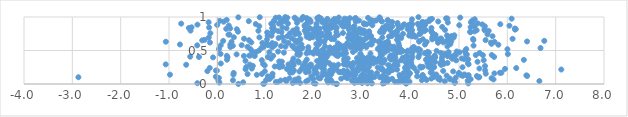
| Category | Series 0 |
|---|---|
| 0.433406203005279 | 0.001 |
| 2.455961428554003 | 0.002 |
| 2.4745443741867836 | 0.003 |
| 0.9495079879234387 | 0.004 |
| 0.9693533342767289 | 0.005 |
| 3.9064680235757203 | 0.006 |
| 2.032211599027284 | 0.007 |
| 3.4237041263236727 | 0.008 |
| 5.191488238184567 | 0.009 |
| 3.197623193400388 | 0.01 |
| 3.1062827954152468 | 0.011 |
| -0.4133370172218176 | 0.012 |
| 1.9940901045999615 | 0.013 |
| 3.454002756618558 | 0.014 |
| 2.9946979914708836 | 0.015 |
| 1.5606047050287666 | 0.016 |
| 1.711043177630597 | 0.017 |
| 2.835530518199697 | 0.018 |
| 4.913410823604459 | 0.019 |
| 3.9270730843557264 | 0.02 |
| 0.04179513812483959 | 0.021 |
| 4.9093540350894465 | 0.022 |
| 2.3823111095607628 | 0.023 |
| 2.2913278669526655 | 0.024 |
| 0.5345523313564993 | 0.025 |
| 3.1421569388580415 | 0.026 |
| 3.867961752969226 | 0.027 |
| 2.9026171103836513 | 0.028 |
| 1.2473112850614152 | 0.029 |
| 1.2107270474180178 | 0.03 |
| 2.928849977832298 | 0.031 |
| 3.678643029461803 | 0.032 |
| 3.7395020028709856 | 0.033 |
| 1.6294021524454356 | 0.034 |
| 3.442477697648176 | 0.035 |
| 3.9755267955850773 | 0.036 |
| 1.8344930540314195 | 0.037 |
| 3.5189481904066566 | 0.038 |
| 2.324864171294502 | 0.039 |
| 3.7868283321641827 | 0.04 |
| 4.706785700476023 | 0.041 |
| 3.7609331124991474 | 0.042 |
| 1.4282557488124037 | 0.043 |
| 6.662456215287102 | 0.044 |
| 3.12931189677252 | 0.045 |
| 4.903055705513007 | 0.046 |
| 2.985785873077796 | 0.047 |
| 0.021490604469981633 | 0.048 |
| 5.180719284607355 | 0.049 |
| 2.783544893933005 | 0.05 |
| 3.477694237530164 | 0.051 |
| 2.3557930262261646 | 0.052 |
| 1.3084953975069364 | 0.053 |
| 3.5257851961947537 | 0.054 |
| 1.8752772858321407 | 0.055 |
| 0.3236483525478566 | 0.056 |
| 2.272043295873837 | 0.057 |
| 4.230857491975614 | 0.058 |
| 1.0105811214308886 | 0.059 |
| 4.3293069638605 | 0.06 |
| 3.0391172939564073 | 0.061 |
| 4.607147102071846 | 0.062 |
| 1.4023565384671621 | 0.063 |
| 3.547443763331814 | 0.064 |
| 1.6080654978058684 | 0.065 |
| 2.27851862813694 | 0.066 |
| 2.9180463560958176 | 0.067 |
| 5.714169577120845 | 0.068 |
| 4.81631328014728 | 0.069 |
| 3.172775093318746 | 0.07 |
| 2.335980047589448 | 0.071 |
| 5.241093778006275 | 0.072 |
| 1.0809395475607664 | 0.073 |
| 4.57223646115447 | 0.074 |
| 3.8013023312159326 | 0.075 |
| 3.8848486855044384 | 0.076 |
| 1.9826239745048655 | 0.077 |
| 3.616203335723952 | 0.078 |
| 3.8661238379159437 | 0.079 |
| 2.5627440927354077 | 0.08 |
| 4.427377434416879 | 0.081 |
| 4.807672710640514 | 0.082 |
| 2.1267868229194655 | 0.083 |
| 1.6797824712612184 | 0.084 |
| 1.4921432337653746 | 0.085 |
| 2.686488584569814 | 0.086 |
| 5.673363791608432 | 0.087 |
| 3.8794747989132143 | 0.088 |
| 3.1485458946173868 | 0.089 |
| 4.285569995633408 | 0.09 |
| 0.031613688493364656 | 0.091 |
| 2.8314805430813177 | 0.092 |
| 2.090443932333257 | 0.093 |
| 4.929931007135928 | 0.094 |
| 4.590932748839785 | 0.095 |
| 2.9896711352269487 | 0.096 |
| 3.1190349602360223 | 0.097 |
| 5.400661633794589 | 0.098 |
| 3.401215901869634 | 0.099 |
| 3.3640839062461936 | 0.1 |
| -2.874371161384751 | 0.101 |
| 3.495555616137263 | 0.102 |
| 5.420175968604175 | 0.103 |
| 3.2505829812392024 | 0.104 |
| 4.476533786275703 | 0.105 |
| 3.213087481304124 | 0.106 |
| 2.645851072830028 | 0.107 |
| -0.03139757301020074 | 0.108 |
| 3.9402070032409062 | 0.109 |
| 1.137892811341772 | 0.11 |
| 3.7812016109737723 | 0.111 |
| 2.966747583356991 | 0.112 |
| 1.945159183891883 | 0.113 |
| 1.0470969959560064 | 0.114 |
| 4.134707946744852 | 0.115 |
| 3.0568385883245495 | 0.116 |
| 4.232409495364311 | 0.117 |
| 3.082870049978325 | 0.118 |
| 5.370573303278861 | 0.119 |
| 6.4110882686164175 | 0.12 |
| 5.076096046817723 | 0.121 |
| 3.4249545165637065 | 0.122 |
| 2.660474854600866 | 0.123 |
| 5.167292493237691 | 0.124 |
| 4.744724965480547 | 0.125 |
| 2.9901152619849936 | 0.126 |
| 2.267688651592453 | 0.127 |
| 2.1712707075257804 | 0.128 |
| 6.394194503319242 | 0.129 |
| 2.774944910618179 | 0.13 |
| 2.8219280828635895 | 0.131 |
| 5.19954475353272 | 0.132 |
| 5.044163896952343 | 0.133 |
| 3.7696930359223186 | 0.134 |
| 4.2500208464785985 | 0.135 |
| 3.1634540883453193 | 0.136 |
| 0.8170210754855374 | 0.137 |
| 3.9553654544281756 | 0.138 |
| -0.9797764063120287 | 0.139 |
| 0.3330916016052976 | 0.14 |
| 2.7231767775907443 | 0.141 |
| 4.530317933429905 | 0.142 |
| 5.112469271632039 | 0.143 |
| 2.23538095463981 | 0.144 |
| 2.3571346448311568 | 0.145 |
| 2.8554680689556866 | 0.146 |
| 2.793147388001092 | 0.147 |
| 0.6248139546530149 | 0.148 |
| 3.0162759317916072 | 0.149 |
| 0.9227392671378563 | 0.15 |
| 2.2787335454412037 | 0.151 |
| 4.991888161631538 | 0.152 |
| 1.1424394217673832 | 0.153 |
| 5.553505389482748 | 0.154 |
| 2.7567883056229574 | 0.155 |
| 2.8413105623002033 | 0.156 |
| 2.685169831352669 | 0.157 |
| 5.73212138711806 | 0.158 |
| 2.0135413961092326 | 0.159 |
| 3.9862191104444022 | 0.16 |
| 2.060564953010336 | 0.161 |
| 4.448554153877141 | 0.162 |
| 3.3044871747594016 | 0.163 |
| 3.855711654246229 | 0.164 |
| 0.3383989878018201 | 0.165 |
| 4.999446941886108 | 0.166 |
| 5.846532609830787 | 0.167 |
| 5.87810869456047 | 0.168 |
| 4.414516732018474 | 0.169 |
| 1.5044925813611623 | 0.17 |
| 3.544043676043983 | 0.171 |
| 3.1868985063273465 | 0.172 |
| 1.5525500208391323 | 0.173 |
| 2.1873850770681047 | 0.174 |
| 2.5980843754538854 | 0.175 |
| 2.8413041428056927 | 0.176 |
| 1.8333673138569937 | 0.177 |
| 2.5311164969131332 | 0.178 |
| 2.561619623746897 | 0.179 |
| 2.5184609847732724 | 0.18 |
| 1.558586708428746 | 0.181 |
| 3.458095119259605 | 0.182 |
| 3.9337303444747667 | 0.183 |
| 1.8930225047535307 | 0.184 |
| 4.1303122407973 | 0.185 |
| 3.5348796043244493 | 0.186 |
| 1.6984362721324238 | 0.187 |
| 4.879335723067961 | 0.188 |
| 2.39066929555055 | 0.189 |
| 0.9820616294683111 | 0.19 |
| 2.349471948776383 | 0.191 |
| -0.20622812885411523 | 0.192 |
| 2.6870245118536706 | 0.193 |
| 3.5644388220072227 | 0.194 |
| 4.672495970156278 | 0.195 |
| 2.6109930012156215 | 0.196 |
| 3.1085158095455934 | 0.197 |
| 2.6140681158383563 | 0.198 |
| 2.9175555346233377 | 0.199 |
| -0.009156678107293814 | 0.2 |
| -0.029717201938892046 | 0.201 |
| 2.3296456316821827 | 0.202 |
| 1.516201662804892 | 0.203 |
| 5.5420797187697985 | 0.204 |
| 1.5841806196667418 | 0.205 |
| 2.017050925264892 | 0.206 |
| 3.537529636797519 | 0.207 |
| 3.6228718284947594 | 0.208 |
| 1.8771756532021673 | 0.209 |
| 2.869864289640559 | 0.21 |
| 3.5956838509661435 | 0.211 |
| 3.0702563854134266 | 0.212 |
| 3.423742710201323 | 0.213 |
| 3.7187169872235666 | 0.214 |
| 2.812386476052351 | 0.215 |
| 7.116300941701926 | 0.216 |
| 4.433614699789565 | 0.217 |
| 2.0163643150392647 | 0.218 |
| 2.2096791085026504 | 0.219 |
| 0.5841887295727042 | 0.22 |
| 2.033441266630586 | 0.221 |
| 3.387893006235012 | 0.222 |
| 3.0115222725438593 | 0.223 |
| 1.4406813242816647 | 0.224 |
| 1.74310093903213 | 0.225 |
| 5.952122613992327 | 0.226 |
| 3.899275799053804 | 0.227 |
| 3.5916824842867983 | 0.228 |
| 2.461454934377313 | 0.229 |
| 0.7125802124828446 | 0.23 |
| 5.422002526063665 | 0.231 |
| 3.402020201747456 | 0.232 |
| 3.939506963020597 | 0.233 |
| 3.894789101516804 | 0.234 |
| 4.076907313685656 | 0.235 |
| 3.0404356301352604 | 0.236 |
| 1.8185088259299738 | 0.237 |
| 6.184413097506664 | 0.238 |
| 2.164233322044132 | 0.239 |
| -0.15672266387859857 | 0.24 |
| 2.394444686801133 | 0.241 |
| 1.52142980942165 | 0.242 |
| 2.970563321985286 | 0.243 |
| 4.2157361777445495 | 0.244 |
| 3.8846207362941456 | 0.245 |
| 1.9062157312703696 | 0.246 |
| 2.914615563894199 | 0.247 |
| 3.3177005627014244 | 0.248 |
| 1.2862369824787816 | 0.249 |
| 5.072657080252856 | 0.25 |
| 2.999518489264708 | 0.251 |
| 4.487516456978575 | 0.252 |
| 4.438827066100286 | 0.253 |
| 0.5990141986188813 | 0.254 |
| 4.2508821463535975 | 0.255 |
| 4.369271166178407 | 0.256 |
| 1.8432811012393557 | 0.257 |
| 2.0633296960884855 | 0.258 |
| 3.1383309955955863 | 0.259 |
| 4.198999931151551 | 0.26 |
| 1.1870391838443677 | 0.261 |
| 1.822377488826266 | 0.262 |
| 1.344572357039262 | 0.263 |
| 2.7681112013616924 | 0.264 |
| 1.9371781937895758 | 0.265 |
| 1.2547523981015107 | 0.266 |
| 4.032393742789642 | 0.267 |
| 5.538436932031248 | 0.268 |
| 3.5686026573446243 | 0.269 |
| 0.7343409698867789 | 0.27 |
| 4.424094634146526 | 0.271 |
| 2.2096152797087774 | 0.272 |
| 1.7718779706575765 | 0.273 |
| 1.3306792589776077 | 0.274 |
| 1.9033420260042475 | 0.275 |
| 3.6695706444362544 | 0.276 |
| 0.9806171049153694 | 0.277 |
| 3.7278641329516864 | 0.278 |
| 2.410791099965361 | 0.279 |
| 2.3608054717036087 | 0.28 |
| 1.5797645903532418 | 0.281 |
| 3.537570186387234 | 0.282 |
| 2.6793927417191123 | 0.283 |
| 2.932873720122935 | 0.284 |
| 4.631332082336149 | 0.285 |
| 3.016490131911206 | 0.286 |
| -0.6446765844134013 | 0.287 |
| 2.5011338826058247 | 0.288 |
| 0.673159879223574 | 0.289 |
| 2.8064738042508948 | 0.29 |
| 1.9350010330616683 | 0.291 |
| 1.4710841373510188 | 0.292 |
| -1.067251602480349 | 0.293 |
| 5.198583349350598 | 0.294 |
| 2.6166351177052034 | 0.295 |
| 2.197346859856952 | 0.296 |
| 2.6582796417986283 | 0.297 |
| 0.9474509103472548 | 0.298 |
| 3.6711489328508753 | 0.299 |
| 4.687769789112732 | 0.3 |
| 3.937931021520515 | 0.301 |
| 3.002494293468421 | 0.302 |
| 2.1142414061964745 | 0.303 |
| 2.7261535059268813 | 0.304 |
| 4.347881903017035 | 0.305 |
| 0.071565977491439 | 0.306 |
| 3.057749961234721 | 0.307 |
| 3.225472294749322 | 0.308 |
| 4.612884780207927 | 0.309 |
| 5.1850954145798696 | 0.31 |
| 2.313745448356408 | 0.311 |
| 3.392146835378293 | 0.312 |
| 3.1610323694090567 | 0.313 |
| 4.762838548146766 | 0.314 |
| 2.8113030056176096 | 0.315 |
| 4.012001490852661 | 0.316 |
| 1.5652368719003151 | 0.317 |
| 3.0320992184602122 | 0.318 |
| 3.4390666586129077 | 0.319 |
| 3.8981279942992657 | 0.32 |
| 4.6740196753586485 | 0.321 |
| 1.6881831441328559 | 0.322 |
| 3.720119070272841 | 0.323 |
| 2.960474281754348 | 0.324 |
| 4.658906868766254 | 0.325 |
| 2.249874276477222 | 0.326 |
| 1.8170352289345493 | 0.327 |
| 2.218926855445053 | 0.328 |
| 4.504396182942956 | 0.329 |
| 2.937090507548071 | 0.33 |
| 3.2926480081245035 | 0.331 |
| 5.383044562931419 | 0.332 |
| 1.3350791302983214 | 0.333 |
| 2.1539800166078162 | 0.334 |
| 2.9099082290787903 | 0.335 |
| 1.551092722400432 | 0.336 |
| 1.2808134876521806 | 0.337 |
| 3.146044698958432 | 0.338 |
| 2.911539946373089 | 0.339 |
| 4.421425987124862 | 0.34 |
| 1.670607375625044 | 0.341 |
| 2.6677681504309625 | 0.342 |
| 3.6869777367346264 | 0.343 |
| 2.066003015287592 | 0.344 |
| 4.379432438147376 | 0.345 |
| 0.5828494873369667 | 0.346 |
| 2.625524414901472 | 0.347 |
| 3.054927460145107 | 0.348 |
| 3.9316433258300263 | 0.349 |
| 4.64523830556751 | 0.35 |
| 3.3163692954578456 | 0.351 |
| 3.80158365987931 | 0.352 |
| 4.94071738618581 | 0.353 |
| 3.397151115394642 | 0.354 |
| 5.511507489218757 | 0.355 |
| 0.9200240048465811 | 0.356 |
| 2.9530509573819392 | 0.357 |
| 3.4624518285455097 | 0.358 |
| 3.2261044184439784 | 0.359 |
| 6.342050448670875 | 0.36 |
| 2.1489383638727384 | 0.361 |
| 4.316988510900666 | 0.362 |
| 0.2004284523663049 | 0.363 |
| 3.59413761229386 | 0.364 |
| 1.8508825857323807 | 0.365 |
| 2.236741245863824 | 0.366 |
| 3.255358244175054 | 0.367 |
| 3.0695281044987026 | 0.368 |
| 5.189724500962329 | 0.369 |
| 2.629705236256157 | 0.37 |
| 5.109261519629397 | 0.371 |
| 3.6002409682398744 | 0.372 |
| 3.1036273068125277 | 0.373 |
| 4.341620644056496 | 0.374 |
| 4.021090957251289 | 0.375 |
| 3.33515232051637 | 0.376 |
| 4.858507284054639 | 0.377 |
| 1.1078842212109339 | 0.378 |
| 4.393679317864555 | 0.379 |
| 1.5742667782113124 | 0.38 |
| 5.056246118223488 | 0.381 |
| 2.697105298945747 | 0.382 |
| 2.631431480851429 | 0.383 |
| 2.1446063875739867 | 0.384 |
| 3.2240754921127164 | 0.385 |
| 3.1623550148128694 | 0.386 |
| 2.890325377794781 | 0.387 |
| 3.5781290913128942 | 0.388 |
| 3.6842786999521917 | 0.389 |
| 4.645459688118855 | 0.39 |
| 3.8377093619774802 | 0.391 |
| 4.461653870912027 | 0.392 |
| 4.504455097273155 | 0.393 |
| 3.0199913646056915 | 0.394 |
| 3.112117187130057 | 0.395 |
| 4.5003339397737285 | 0.396 |
| -0.08806049532351246 | 0.397 |
| 0.21103122803625762 | 0.398 |
| 3.566890213062631 | 0.399 |
| 4.16160637055626 | 0.4 |
| 3.368035666374416 | 0.401 |
| 1.04578313792129 | 0.402 |
| -0.3800176235504078 | 0.403 |
| 5.726043314264685 | 0.404 |
| 2.193879711319996 | 0.405 |
| 3.6049676504243084 | 0.406 |
| 4.360779487615515 | 0.407 |
| -0.5607185213989334 | 0.408 |
| 2.2678868247910695 | 0.409 |
| 3.9009364545702705 | 0.41 |
| 4.035483805236081 | 0.411 |
| 4.835733636397794 | 0.412 |
| 3.9373779891942373 | 0.413 |
| 4.764167917381586 | 0.414 |
| 4.499151094981743 | 0.415 |
| 2.1569645219022027 | 0.416 |
| 0.773382963049527 | 0.417 |
| 0.5496712782778808 | 0.418 |
| 0.19712383571018854 | 0.419 |
| 1.1554509146220258 | 0.42 |
| 2.4900248882222353 | 0.421 |
| 2.50055186431308 | 0.422 |
| 4.497658460105326 | 0.423 |
| 0.661734469907155 | 0.424 |
| 4.664985400821825 | 0.425 |
| 0.6840152151315353 | 0.426 |
| 3.5856634208931486 | 0.427 |
| 2.4607021674562026 | 0.428 |
| 4.907435216153153 | 0.429 |
| 4.9335699046222175 | 0.43 |
| 5.494207713090859 | 0.431 |
| 5.347238438976902 | 0.432 |
| 5.678617689675263 | 0.433 |
| 1.6975745666098976 | 0.434 |
| 3.643725784397127 | 0.435 |
| 3.4142717524806434 | 0.436 |
| 2.9670278408366237 | 0.437 |
| 4.181143559498025 | 0.438 |
| 1.6546012893084976 | 0.439 |
| 2.1206696673553296 | 0.44 |
| 5.161439929362242 | 0.441 |
| 0.3985520744067248 | 0.442 |
| 5.144110561220926 | 0.443 |
| 2.1948050813824715 | 0.444 |
| 2.589502192470002 | 0.445 |
| 2.2315340804472177 | 0.446 |
| 6.010787955148325 | 0.447 |
| 3.3811623540324107 | 0.448 |
| 0.0669703798328869 | 0.449 |
| 4.701921866589574 | 0.45 |
| 2.9581791759787506 | 0.451 |
| 2.515397616806584 | 0.452 |
| 2.320815072447309 | 0.453 |
| 1.9879497399550097 | 0.454 |
| 3.1678428668606093 | 0.455 |
| 1.710988028014695 | 0.456 |
| 1.8453657625763844 | 0.457 |
| 2.4112731262098803 | 0.458 |
| 3.703328311315535 | 0.459 |
| 2.661158216050798 | 0.46 |
| 4.293563466866463 | 0.461 |
| 4.628109108987591 | 0.462 |
| 5.425860787480424 | 0.463 |
| 2.0619871193814983 | 0.464 |
| 4.031945940942072 | 0.465 |
| 1.6672273426977728 | 0.466 |
| 4.378380967245059 | 0.467 |
| 1.3770377208201303 | 0.468 |
| 4.334607501041424 | 0.469 |
| 2.2901986574031046 | 0.47 |
| 1.905763268021623 | 0.471 |
| 1.9816371634264445 | 0.472 |
| 5.012767531658353 | 0.473 |
| 3.7923520888815387 | 0.474 |
| 1.076445613893024 | 0.475 |
| 4.785006216247485 | 0.476 |
| 0.8041892866706024 | 0.477 |
| 2.8079577648817264 | 0.478 |
| 3.7115127431072636 | 0.479 |
| 4.3565282359272075 | 0.48 |
| 3.924669154210764 | 0.481 |
| 3.4801497603647578 | 0.482 |
| 3.3747536574856767 | 0.483 |
| 1.2569691152227431 | 0.484 |
| 4.952140727733045 | 0.485 |
| 0.7273218106270702 | 0.486 |
| 4.006741671850092 | 0.487 |
| 2.6281995742712914 | 0.488 |
| 5.121255009041536 | 0.489 |
| 2.082153513624968 | 0.49 |
| 3.8369021635031864 | 0.491 |
| 4.038740595920018 | 0.492 |
| 3.6990181492221588 | 0.493 |
| 4.536777406810884 | 0.494 |
| 2.3927178962503866 | 0.495 |
| 2.376490247176574 | 0.496 |
| 3.9397298980323257 | 0.497 |
| 4.187293627287624 | 0.498 |
| 2.314334449755102 | 0.499 |
| 0.8638335393703644 | 0.5 |
| 2.4006068781474803 | 0.501 |
| 3.8081981224468167 | 0.502 |
| 2.4475117252967165 | 0.503 |
| 1.679416677694042 | 0.504 |
| 4.157709164152692 | 0.505 |
| 1.8814580927107971 | 0.506 |
| 3.534233841369224 | 0.507 |
| 2.861301213557822 | 0.508 |
| 4.123469550183991 | 0.509 |
| 2.1810426567907832 | 0.51 |
| 4.190214176602152 | 0.511 |
| 2.188363399129787 | 0.512 |
| 2.6501265235815863 | 0.513 |
| 2.502724556027992 | 0.514 |
| 2.042908320727541 | 0.515 |
| 1.6291659967353618 | 0.516 |
| 3.7066727538644297 | 0.517 |
| 3.795070881349967 | 0.518 |
| 6.00219980615513 | 0.519 |
| 3.6189308779584493 | 0.52 |
| 0.6841396033289109 | 0.521 |
| 5.150158783307784 | 0.522 |
| 0.03309169611465501 | 0.523 |
| 3.32162139401951 | 0.524 |
| 4.158367186378451 | 0.525 |
| 2.95890756212825 | 0.526 |
| 2.0505112781135977 | 0.527 |
| 3.3461498786121497 | 0.528 |
| 1.7397945440893383 | 0.529 |
| 1.670851817846371 | 0.53 |
| 2.4171147364515866 | 0.531 |
| 3.377906181996736 | 0.532 |
| 4.028331408371848 | 0.533 |
| 2.4291963382982638 | 0.534 |
| 2.483072413417414 | 0.535 |
| 3.4261749440660894 | 0.536 |
| 6.686426519409305 | 0.537 |
| 2.870261077851468 | 0.538 |
| 1.6766756447516191 | 0.539 |
| 2.569212362620612 | 0.54 |
| 1.7607835152036087 | 0.541 |
| 0.9160656279046471 | 0.542 |
| 3.4835627152412743 | 0.543 |
| 2.440502362760679 | 0.544 |
| 1.58014858295097 | 0.545 |
| 2.3295592428665204 | 0.546 |
| 1.1341105295778173 | 0.547 |
| 2.5727856198464725 | 0.548 |
| 2.761122850978768 | 0.549 |
| 1.882267550695599 | 0.55 |
| 3.0833443235360316 | 0.551 |
| 0.2697713250631839 | 0.552 |
| 0.9564743510809466 | 0.553 |
| 4.065871332241483 | 0.554 |
| 0.6239160967858188 | 0.555 |
| 3.3578569498868136 | 0.556 |
| 1.4095347940903782 | 0.557 |
| 3.650947684250004 | 0.558 |
| 2.4889156172853792 | 0.559 |
| 2.2298514723135723 | 0.56 |
| 4.760409120155552 | 0.561 |
| 2.560052455147097 | 0.562 |
| 3.4300165190248606 | 0.563 |
| 3.012232659079433 | 0.564 |
| 1.3180948422192116 | 0.565 |
| 2.8078244535213863 | 0.566 |
| 1.5518126512039 | 0.567 |
| 2.7358919938860566 | 0.568 |
| 3.7615750179383927 | 0.569 |
| 0.3206572423517393 | 0.57 |
| 2.6363325248958573 | 0.571 |
| 3.0740287691272656 | 0.572 |
| 5.301499531344517 | 0.573 |
| 1.1807933034785858 | 0.574 |
| 2.9662492178466353 | 0.575 |
| 2.547873241393516 | 0.576 |
| -0.4158133495187366 | 0.577 |
| 0.07039361457154891 | 0.578 |
| 0.5035263471366909 | 0.579 |
| 2.724523874162406 | 0.58 |
| 1.0477334325195327 | 0.581 |
| 3.5527667802479765 | 0.582 |
| 2.086512933662128 | 0.583 |
| 2.981917200279558 | 0.584 |
| 3.028446957222494 | 0.585 |
| 5.81464204146905 | 0.586 |
| 0.26736635667118236 | 0.587 |
| 3.5277819386641776 | 0.588 |
| 4.296208425006819 | 0.589 |
| -0.7739587141010591 | 0.59 |
| 3.1851831438927736 | 0.591 |
| 1.7380254972944496 | 0.592 |
| 3.193120808980883 | 0.593 |
| 3.1349276852364905 | 0.594 |
| 1.2025734217259778 | 0.595 |
| 2.9128353618555094 | 0.596 |
| 4.821024712939735 | 0.597 |
| 2.505680207517943 | 0.598 |
| 2.050070210986487 | 0.599 |
| 5.672996780629094 | 0.6 |
| 3.489089492953931 | 0.601 |
| 2.1106408712281706 | 0.602 |
| 1.0230679247254542 | 0.603 |
| 2.8664187945003947 | 0.604 |
| 4.808797614633658 | 0.605 |
| 2.4955650422133755 | 0.606 |
| 3.4177590396343533 | 0.607 |
| 2.9343512012896134 | 0.608 |
| 3.749816244807996 | 0.609 |
| 2.82026849849081 | 0.61 |
| 1.1355054009805223 | 0.611 |
| 2.6910185308860743 | 0.612 |
| 0.9322093396578497 | 0.613 |
| 1.4700845480899565 | 0.614 |
| 3.4729101880143913 | 0.615 |
| 4.565893802682581 | 0.616 |
| 1.638109073699464 | 0.617 |
| 5.659306108416317 | 0.618 |
| -0.15276604617496492 | 0.619 |
| 0.7035137384753565 | 0.62 |
| 4.675180781963589 | 0.621 |
| 2.856774253748384 | 0.622 |
| 3.5243885883026738 | 0.623 |
| 3.347024291261736 | 0.624 |
| 2.87752108895916 | 0.625 |
| 2.9647668901272137 | 0.626 |
| 4.330594238841755 | 0.627 |
| 0.29307632895618596 | 0.628 |
| 2.2123204405173076 | 0.629 |
| 5.734561677575673 | 0.63 |
| -1.0650030043852805 | 0.631 |
| 2.2090527775204665 | 0.632 |
| 4.174195392402346 | 0.633 |
| 3.5275220634465563 | 0.634 |
| 6.408172183634524 | 0.635 |
| 4.839449702326126 | 0.636 |
| 2.8110176293733207 | 0.637 |
| 1.382195723833624 | 0.638 |
| 3.3490387043745042 | 0.639 |
| 3.0009338467758426 | 0.64 |
| 4.736927624317694 | 0.641 |
| 4.182017834565283 | 0.642 |
| 0.12062893557243548 | 0.643 |
| 6.764455614192863 | 0.644 |
| 2.819413113148864 | 0.645 |
| 4.64359753623666 | 0.646 |
| 2.118482446827164 | 0.647 |
| 3.1989189392086548 | 0.648 |
| 3.24440365647332 | 0.649 |
| 1.6783476506520731 | 0.65 |
| -0.3125825787445353 | 0.651 |
| 1.6030587880665648 | 0.652 |
| 3.0173136667780573 | 0.653 |
| 0.6550587095220917 | 0.654 |
| 5.54966468524537 | 0.655 |
| 4.7802441754303455 | 0.656 |
| 5.298493704578603 | 0.657 |
| 3.7193515204937273 | 0.658 |
| -0.2633702113294314 | 0.659 |
| 2.8862126609704326 | 0.66 |
| 2.107040877416879 | 0.661 |
| 2.788918780522762 | 0.662 |
| 4.616694892391294 | 0.663 |
| 1.0275708159139736 | 0.664 |
| 3.0469415878625625 | 0.665 |
| 4.4449987683237495 | 0.666 |
| 4.253578885863677 | 0.667 |
| 4.538027839028743 | 0.668 |
| 2.419005717697874 | 0.669 |
| 1.7185799822889232 | 0.67 |
| 2.3615620061764417 | 0.671 |
| 5.2910543359408395 | 0.672 |
| 2.9557889577906487 | 0.673 |
| 6.1084901529951985 | 0.674 |
| 4.6058478560979035 | 0.675 |
| 0.5524418283434813 | 0.676 |
| 2.084470722640273 | 0.677 |
| 2.773500131204369 | 0.678 |
| 4.632794359560576 | 0.679 |
| 2.7613675217681783 | 0.68 |
| 2.3496660458149328 | 0.681 |
| 2.3532399234290633 | 0.682 |
| 1.5362456270906817 | 0.683 |
| 2.2535861264555224 | 0.684 |
| 1.911321850261566 | 0.685 |
| 3.804096429615845 | 0.686 |
| 1.2681983267011554 | 0.687 |
| 2.897977594607121 | 0.688 |
| 2.706406504386643 | 0.689 |
| 3.0949153439802872 | 0.69 |
| 2.7263230643415395 | 0.691 |
| 2.843593192365079 | 0.692 |
| -0.17754762908401123 | 0.693 |
| 4.890269326994727 | 0.694 |
| 3.413808735385761 | 0.695 |
| 0.8698611352930188 | 0.696 |
| 0.34231317266349626 | 0.697 |
| 3.7350290800026062 | 0.698 |
| 1.9733555228354005 | 0.699 |
| 4.449302514183446 | 0.7 |
| 4.784879816842409 | 0.701 |
| 1.3436661917687727 | 0.702 |
| 2.8872435029314722 | 0.703 |
| 4.1016230454805305 | 0.704 |
| 1.8494290577876615 | 0.705 |
| 2.8254962831850934 | 0.706 |
| 3.5522301875087092 | 0.707 |
| 3.1779742017940515 | 0.708 |
| 2.3288358780782956 | 0.709 |
| 1.4457506580499229 | 0.71 |
| 4.030099690452914 | 0.711 |
| 2.0894168920850964 | 0.712 |
| 5.693652647094421 | 0.713 |
| 2.304383796227955 | 0.714 |
| 3.179939523978291 | 0.715 |
| 4.845860091745649 | 0.716 |
| 3.611327301931105 | 0.717 |
| 4.0519131146681335 | 0.718 |
| 3.7356770899286595 | 0.719 |
| 1.1215106141185158 | 0.72 |
| 1.0410696961055734 | 0.721 |
| 3.968272901106959 | 0.722 |
| 2.1594479198406895 | 0.723 |
| 1.8982602998522062 | 0.724 |
| 4.752029349246299 | 0.725 |
| 2.456047393004546 | 0.726 |
| 4.903282584371974 | 0.727 |
| 2.1606950865002688 | 0.728 |
| 2.2594063989522537 | 0.729 |
| 3.6049946517772886 | 0.73 |
| 2.492041735757731 | 0.731 |
| 1.9086805346907525 | 0.732 |
| 4.514801809786917 | 0.733 |
| 1.9323273196818311 | 0.734 |
| 4.055898167637267 | 0.735 |
| 2.055166262911299 | 0.736 |
| 0.2519305842865762 | 0.737 |
| 0.23128825831917155 | 0.738 |
| 2.724087531511993 | 0.739 |
| 5.590392787836403 | 0.74 |
| 3.6315465753432505 | 0.741 |
| 1.6090343567843135 | 0.742 |
| 2.7655531145411705 | 0.743 |
| 4.181626582607212 | 0.744 |
| 3.9950443377253535 | 0.745 |
| 1.6876913323653793 | 0.746 |
| 2.8816339047025012 | 0.747 |
| 3.8418483145872715 | 0.748 |
| 3.6786690438356473 | 0.749 |
| 2.091434290832583 | 0.75 |
| 3.6213331436292706 | 0.751 |
| 4.201980921285702 | 0.752 |
| 3.0420309211862655 | 0.753 |
| 2.3143658981811335 | 0.754 |
| 2.1513137765782524 | 0.755 |
| 1.499580577001565 | 0.756 |
| -0.14489399039814854 | 0.757 |
| 1.8382729985863744 | 0.758 |
| 4.457689118148423 | 0.759 |
| 3.649594437165723 | 0.76 |
| 2.5997120580508013 | 0.761 |
| 3.704809809416829 | 0.762 |
| 2.973268663865218 | 0.763 |
| 3.134300338443226 | 0.764 |
| 3.986528395012252 | 0.765 |
| 1.66751702351735 | 0.766 |
| 4.441668978224072 | 0.767 |
| 1.6540784781137718 | 0.768 |
| 1.0316323183802463 | 0.769 |
| 3.0279408801024874 | 0.77 |
| 1.9962290190473757 | 0.771 |
| 5.2360925998217684 | 0.772 |
| 3.4315709814473596 | 0.773 |
| 2.0138065545587818 | 0.774 |
| 1.3280722523914394 | 0.775 |
| 3.3672070378182384 | 0.776 |
| 2.4634724113192106 | 0.777 |
| 1.1443658774851975 | 0.778 |
| 2.8290554980543017 | 0.779 |
| 5.229556908896807 | 0.78 |
| 0.4268464575729829 | 0.781 |
| 3.703661770702806 | 0.782 |
| 3.7109467767123725 | 0.783 |
| 3.004583689383405 | 0.784 |
| 5.32094071202858 | 0.785 |
| 3.1411239257884422 | 0.786 |
| 1.1426457598375745 | 0.787 |
| 1.2617915230447938 | 0.788 |
| 4.283393603477876 | 0.789 |
| 3.0448842332979464 | 0.79 |
| 3.720758303330289 | 0.791 |
| 4.422170017706955 | 0.792 |
| 5.614569176102279 | 0.793 |
| 0.8493543038286822 | 0.794 |
| 2.2501942348540487 | 0.795 |
| 1.8078739477739396 | 0.796 |
| -0.5544743269674441 | 0.797 |
| 1.5682279076661771 | 0.798 |
| 3.0177569729779714 | 0.799 |
| 3.38693847365504 | 0.8 |
| 5.533473392329973 | 0.801 |
| 5.365750933346096 | 0.802 |
| 4.029190949022382 | 0.803 |
| 2.926097718102643 | 0.804 |
| 4.310488774648139 | 0.805 |
| 4.244672905341181 | 0.806 |
| 4.710173663320869 | 0.807 |
| 3.572761339476068 | 0.808 |
| 3.4621737806722734 | 0.809 |
| 1.8838535667638516 | 0.81 |
| 2.0614052185524443 | 0.811 |
| 6.1600434017434775 | 0.812 |
| 2.7206120991464062 | 0.813 |
| 1.9880804363959195 | 0.814 |
| 4.189571502372137 | 0.815 |
| 5.527152832385046 | 0.816 |
| 0.40220485236238623 | 0.817 |
| 1.1754391763206034 | 0.818 |
| 6.17406793055141 | 0.819 |
| 3.9373380920805885 | 0.82 |
| 2.9419353127894157 | 0.821 |
| 2.8231315994851194 | 0.822 |
| 0.18304157175508617 | 0.823 |
| 2.2895745783426977 | 0.824 |
| 2.0713561642423213 | 0.825 |
| 1.64435139397228 | 0.826 |
| 2.1186507833857937 | 0.827 |
| 6.158114149359822 | 0.828 |
| 3.7532518948630984 | 0.829 |
| 0.265526672374635 | 0.83 |
| 1.4323805425429086 | 0.831 |
| 2.3480041037723245 | 0.832 |
| 1.8350236453185782 | 0.833 |
| 1.9098614023097236 | 0.834 |
| 1.134139401423862 | 0.835 |
| -0.5878626644691649 | 0.836 |
| 4.429996666419036 | 0.837 |
| 2.468934818640875 | 0.838 |
| 3.809543090708922 | 0.839 |
| 3.4274720781585213 | 0.84 |
| 2.44351654638255 | 0.841 |
| 2.4431514798430225 | 0.842 |
| -0.16949993113570727 | 0.843 |
| 2.8026636789105424 | 0.844 |
| 1.3466104321034407 | 0.845 |
| -0.5330952326035923 | 0.846 |
| 2.2170458575128387 | 0.847 |
| 5.2402581341560195 | 0.848 |
| 2.3343733352314575 | 0.849 |
| 4.229462705824324 | 0.85 |
| 2.051441753805836 | 0.851 |
| 4.6516087271810385 | 0.852 |
| 4.002000660978298 | 0.853 |
| 3.603255124123282 | 0.854 |
| 2.60746497998761 | 0.855 |
| 3.5552774640914655 | 0.856 |
| 4.000154925779937 | 0.857 |
| 1.809932197746662 | 0.858 |
| 3.594403559749219 | 0.859 |
| 3.616126619853838 | 0.86 |
| 5.5355481625212715 | 0.861 |
| 5.321593084098929 | 0.862 |
| 0.8669440533867943 | 0.863 |
| 2.836526361071944 | 0.864 |
| 2.6547649849035624 | 0.865 |
| 3.498540254553014 | 0.866 |
| 4.176375337329732 | 0.867 |
| 1.1525750438819675 | 0.868 |
| 3.490579229114693 | 0.869 |
| 6.043570042188835 | 0.87 |
| 2.4106232425520386 | 0.871 |
| 3.5584662694662983 | 0.872 |
| 0.23629581470133632 | 0.873 |
| 2.707146647073477 | 0.874 |
| 1.8041909027641725 | 0.875 |
| 3.2074849572254185 | 0.876 |
| 5.005749529686613 | 0.877 |
| 3.954541686641201 | 0.878 |
| 2.274903886593914 | 0.879 |
| 3.8481042300913977 | 0.88 |
| -0.0029521441713376007 | 0.881 |
| 4.287224434723146 | 0.882 |
| 4.299244544626649 | 0.883 |
| 3.7325193455577304 | 0.884 |
| 4.263436383197227 | 0.885 |
| -0.41141295982922 | 0.886 |
| 2.565117763461661 | 0.887 |
| 1.8474802208342491 | 0.888 |
| 5.4813793129961565 | 0.889 |
| 3.869056946226524 | 0.89 |
| 3.083024274492106 | 0.891 |
| 5.854399543356325 | 0.892 |
| 4.035453024304858 | 0.893 |
| 2.702784909425456 | 0.894 |
| 0.7953019800561787 | 0.895 |
| 3.0359046873393067 | 0.896 |
| 2.052505201467964 | 0.897 |
| 4.149260604577838 | 0.898 |
| 1.116683316955938 | 0.899 |
| 4.003136803804116 | 0.9 |
| -0.747428539033177 | 0.901 |
| 1.4607098751265335 | 0.902 |
| 1.2691367838765908 | 0.903 |
| 2.35322742675946 | 0.904 |
| 5.387398771969469 | 0.905 |
| 3.0336547437552333 | 0.906 |
| 2.3739480557266317 | 0.907 |
| 1.8634652039135178 | 0.908 |
| 1.8586631675150125 | 0.909 |
| 3.7270211396595228 | 0.91 |
| 3.1601588818236532 | 0.911 |
| 2.4334018087994327 | 0.912 |
| 1.648771019153477 | 0.913 |
| 1.312769200664757 | 0.914 |
| 4.276799787677895 | 0.915 |
| 2.234990212551887 | 0.916 |
| 4.314006496955575 | 0.917 |
| 4.7688443647494 | 0.918 |
| 4.264546080887561 | 0.919 |
| 4.324249644123343 | 0.92 |
| -0.1798737168655551 | 0.921 |
| 2.16970606382563 | 0.922 |
| 5.2455414640403415 | 0.923 |
| 5.277176310841735 | 0.924 |
| 3.616753098380958 | 0.925 |
| 4.239673425184095 | 0.926 |
| 1.9286302573239458 | 0.927 |
| 2.595793363951959 | 0.928 |
| 2.501599820994494 | 0.929 |
| 0.13044728871891031 | 0.93 |
| 2.704339062762747 | 0.931 |
| 2.8641656965674644 | 0.932 |
| 4.569102227508601 | 0.933 |
| 3.4056036122929627 | 0.934 |
| 1.3830981009200483 | 0.935 |
| 2.193459866628935 | 0.936 |
| 1.1707441107449736 | 0.937 |
| 0.6507513954376067 | 0.938 |
| 3.394575898960771 | 0.939 |
| 4.386128848735359 | 0.94 |
| 2.6888209777559346 | 0.941 |
| 3.243318633364139 | 0.942 |
| 0.051347820676002076 | 0.943 |
| 2.3782416800597908 | 0.944 |
| 1.1746374987105606 | 0.945 |
| 2.930762452714575 | 0.946 |
| 1.3204767464978606 | 0.947 |
| 3.287039975108545 | 0.948 |
| 5.278998520878963 | 0.949 |
| 1.885680960225561 | 0.95 |
| 3.522459694633512 | 0.951 |
| 3.5299820921533533 | 0.952 |
| 2.683311982599612 | 0.953 |
| 3.1836892598992943 | 0.954 |
| 1.9157128137604449 | 0.955 |
| 1.4205014265648943 | 0.956 |
| 0.19365704747088985 | 0.957 |
| 1.6475699042416356 | 0.958 |
| 1.8990110838244556 | 0.959 |
| 1.7384239362447107 | 0.96 |
| 1.3834403914201574 | 0.961 |
| 2.085346323100814 | 0.962 |
| 2.2739593553435062 | 0.963 |
| 4.393241915744247 | 0.964 |
| 4.026933329582275 | 0.965 |
| 2.682099024491382 | 0.966 |
| 5.324669465134935 | 0.967 |
| 1.8612392554410686 | 0.968 |
| 1.86629182067038 | 0.969 |
| 1.8711270348024724 | 0.97 |
| 2.2751901925888047 | 0.971 |
| 4.440452361810209 | 0.972 |
| 2.4246041867009733 | 0.973 |
| 2.8395209290041414 | 0.974 |
| 6.08895913871081 | 0.975 |
| 2.6309738871591084 | 0.976 |
| 1.6166122783845562 | 0.977 |
| 4.759690421808775 | 0.978 |
| 4.73166696243612 | 0.979 |
| 2.139832188902433 | 0.98 |
| 3.3655054677318836 | 0.981 |
| 1.7614142044273402 | 0.982 |
| 2.743665085656258 | 0.983 |
| 1.8512109158214933 | 0.984 |
| 2.069914187286068 | 0.985 |
| 2.8613069789202297 | 0.986 |
| 3.117792713575747 | 0.987 |
| 1.4476311032180256 | 0.988 |
| 1.2101715772274297 | 0.989 |
| 1.5992180370396776 | 0.99 |
| 5.025599207754433 | 0.991 |
| 2.512666241913163 | 0.992 |
| 1.2779403809068928 | 0.993 |
| 3.3564083901073403 | 0.994 |
| 0.43468428939360493 | 0.995 |
| 0.8781125512009891 | 0.996 |
| 2.101492483130241 | 0.997 |
| 4.161212406851524 | 0.998 |
| 1.40404563949902 | 0.999 |
| 1.7737551814159245 | 1 |